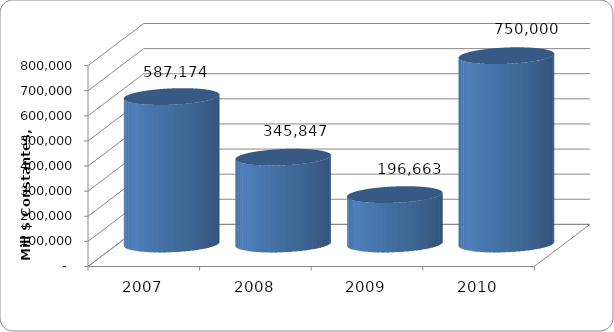
| Category | SALDO DE DEUDA |
|---|---|
| 2007 | 587173.809 |
| 2008 | 345847.464 |
| 2009 | 196662.654 |
| 2010 | 750000 |